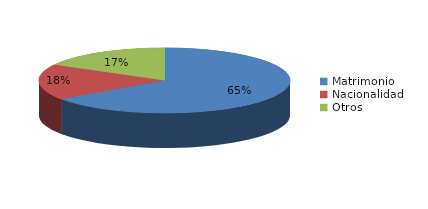
| Category | Series 0 |
|---|---|
| Matrimonio | 409 |
| Nacionalidad | 112 |
| Otros | 106 |